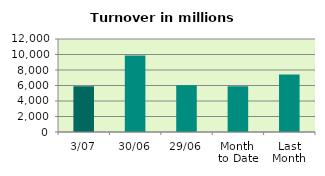
| Category | Series 0 |
|---|---|
| 3/07 | 5918.111 |
| 30/06 | 9885.731 |
| 29/06 | 6042.808 |
| Month 
to Date | 5918.111 |
| Last
Month | 7424.465 |